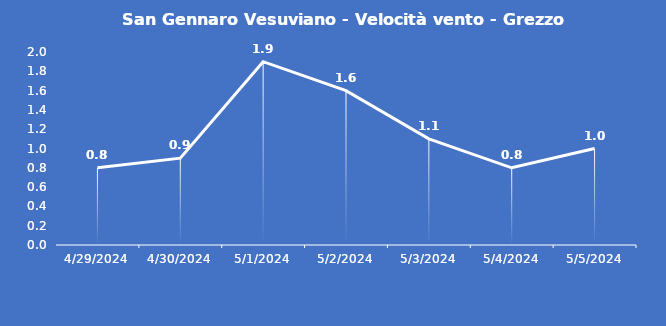
| Category | San Gennaro Vesuviano - Velocità vento - Grezzo (m/s) |
|---|---|
| 4/29/24 | 0.8 |
| 4/30/24 | 0.9 |
| 5/1/24 | 1.9 |
| 5/2/24 | 1.6 |
| 5/3/24 | 1.1 |
| 5/4/24 | 0.8 |
| 5/5/24 | 1 |